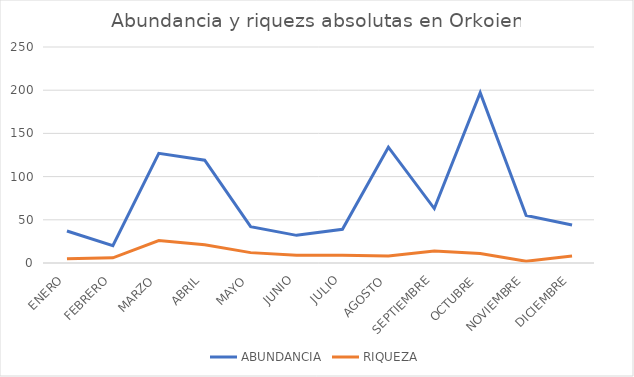
| Category | ABUNDANCIA | RIQUEZA |
|---|---|---|
| ENERO | 37 | 5 |
| FEBRERO | 20 | 6 |
| MARZO | 127 | 26 |
| ABRIL | 119 | 21 |
| MAYO | 42 | 12 |
| JUNIO | 32 | 9 |
| JULIO | 39 | 9 |
| AGOSTO | 134 | 8 |
| SEPTIEMBRE | 63 | 14 |
| OCTUBRE | 197 | 11 |
| NOVIEMBRE | 55 | 2 |
| DICIEMBRE | 44 | 8 |